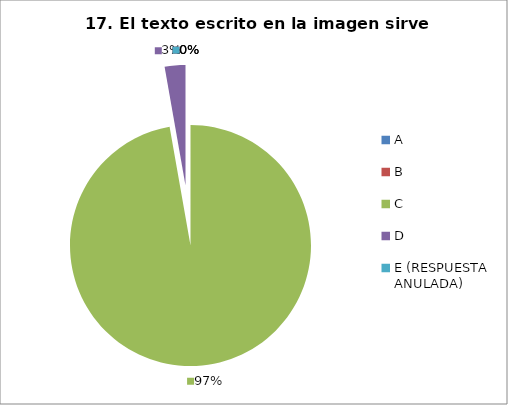
| Category | CANTIDAD DE RESPUESTAS PREGUNTA (17) | PORCENTAJE |
|---|---|---|
| A | 0 | 0 |
| B | 0 | 0 |
| C | 35 | 0.972 |
| D | 1 | 0.028 |
| E (RESPUESTA ANULADA) | 0 | 0 |